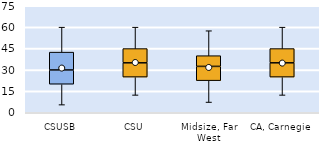
| Category | 25th | 50th | 75th |
|---|---|---|---|
| CSUSB | 20 | 10 | 12.5 |
| CSU | 25 | 10 | 10 |
| Midsize, Far West | 22.5 | 10 | 7.5 |
| CA, Carnegie | 25 | 10 | 10 |